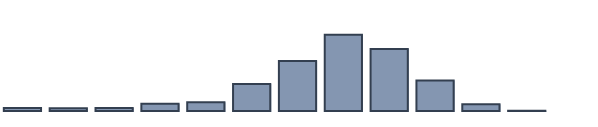
| Category | Series 0 |
|---|---|
| 0 | 1.043 |
| 1 | 0.957 |
| 2 | 1.087 |
| 3 | 2.652 |
| 4 | 3.174 |
| 5 | 9.739 |
| 6 | 18 |
| 7 | 27.522 |
| 8 | 22.304 |
| 9 | 11 |
| 10 | 2.435 |
| 11 | 0.087 |
| 12 | 0 |